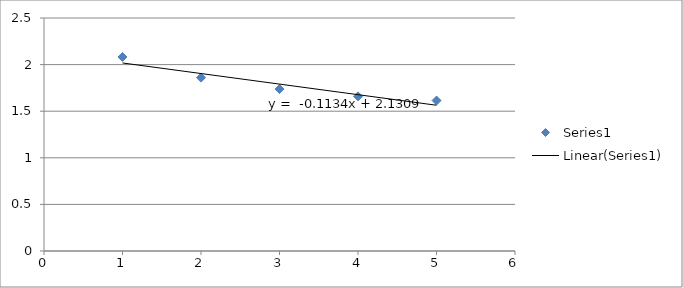
| Category | Series 0 |
|---|---|
| 5.0 | 1.615 |
| 4.0 | 1.66 |
| 3.0 | 1.737 |
| 2.0 | 1.86 |
| 1.0 | 2.082 |